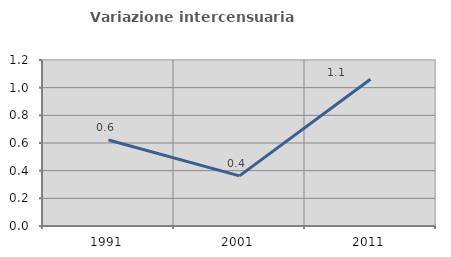
| Category | Variazione intercensuaria annua |
|---|---|
| 1991.0 | 0.622 |
| 2001.0 | 0.362 |
| 2011.0 | 1.061 |